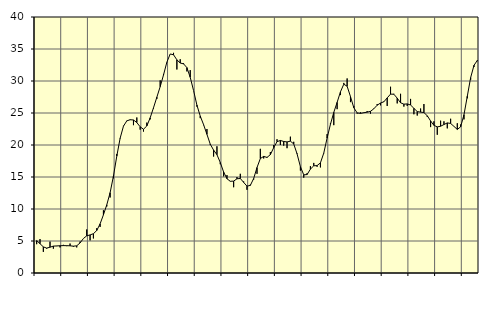
| Category | Piggar | Series 1 |
|---|---|---|
| nan | 4.5 | 5.07 |
| 87.0 | 5.3 | 4.58 |
| 87.0 | 3.3 | 4.08 |
| 87.0 | 3.8 | 3.89 |
| nan | 4.9 | 4.03 |
| 88.0 | 3.8 | 4.2 |
| 88.0 | 4.2 | 4.23 |
| 88.0 | 4 | 4.26 |
| nan | 4.4 | 4.28 |
| 89.0 | 4.2 | 4.27 |
| 89.0 | 4.6 | 4.25 |
| 89.0 | 4.1 | 4.19 |
| nan | 4 | 4.25 |
| 90.0 | 4.9 | 4.7 |
| 90.0 | 5.4 | 5.39 |
| 90.0 | 6.8 | 5.81 |
| nan | 5.1 | 5.95 |
| 91.0 | 5.4 | 6.14 |
| 91.0 | 7 | 6.64 |
| 91.0 | 7.2 | 7.68 |
| nan | 9.8 | 9.09 |
| 92.0 | 10.4 | 10.65 |
| 92.0 | 11.8 | 12.55 |
| 92.0 | 14.8 | 15.14 |
| nan | 18.6 | 18.26 |
| 93.0 | 21 | 21.06 |
| 93.0 | 23 | 22.94 |
| 93.0 | 23.8 | 23.77 |
| nan | 23.9 | 23.95 |
| 94.0 | 23.1 | 23.91 |
| 94.0 | 24.3 | 23.51 |
| 94.0 | 22.4 | 22.84 |
| nan | 22.1 | 22.46 |
| 95.0 | 23.5 | 22.98 |
| 95.0 | 24 | 24.25 |
| 95.0 | 25.7 | 25.82 |
| nan | 27.2 | 27.47 |
| 96.0 | 30.1 | 29.12 |
| 96.0 | 31.1 | 30.95 |
| 96.0 | 32.9 | 32.94 |
| nan | 34.2 | 34.22 |
| 97.0 | 34.4 | 34.1 |
| 97.0 | 31.8 | 33.31 |
| 97.0 | 33.4 | 32.81 |
| nan | 32.8 | 32.68 |
| 98.0 | 31.5 | 32.09 |
| 98.0 | 31.7 | 30.58 |
| 98.0 | 28.5 | 28.5 |
| nan | 26 | 26.23 |
| 99.0 | 24.2 | 24.52 |
| 99.0 | 23.1 | 23.18 |
| 99.0 | 22.5 | 21.67 |
| nan | 20 | 20.13 |
| 0.0 | 18.2 | 19.2 |
| 0.0 | 19.8 | 18.49 |
| 0.0 | 17 | 17.27 |
| nan | 15.1 | 15.78 |
| 1.0 | 15.3 | 14.73 |
| 1.0 | 14.3 | 14.33 |
| 1.0 | 13.4 | 14.36 |
| nan | 15 | 14.72 |
| 2.0 | 15.5 | 14.77 |
| 2.0 | 14.3 | 14.16 |
| 2.0 | 13 | 13.57 |
| nan | 13.8 | 13.69 |
| 3.0 | 14.6 | 14.76 |
| 3.0 | 15.5 | 16.48 |
| 3.0 | 19.4 | 17.88 |
| nan | 17.9 | 18.22 |
| 4.0 | 18 | 18.06 |
| 4.0 | 18.9 | 18.49 |
| 4.0 | 20 | 19.58 |
| nan | 20.9 | 20.52 |
| 5.0 | 20 | 20.71 |
| 5.0 | 19.9 | 20.55 |
| 5.0 | 19.5 | 20.48 |
| nan | 21.3 | 20.6 |
| 6.0 | 20.5 | 20.17 |
| 6.0 | 18.7 | 18.62 |
| 6.0 | 16 | 16.62 |
| nan | 14.9 | 15.34 |
| 7.0 | 15.6 | 15.38 |
| 7.0 | 16.7 | 16.23 |
| 7.0 | 17.2 | 16.75 |
| nan | 16.6 | 16.78 |
| 8.0 | 16.5 | 17.21 |
| 8.0 | 18.7 | 18.74 |
| 8.0 | 21.7 | 21.08 |
| nan | 23.4 | 23.23 |
| 9.0 | 23.1 | 25.1 |
| 9.0 | 25.6 | 26.66 |
| 9.0 | 27.8 | 28.31 |
| nan | 29.7 | 29.5 |
| 10.0 | 30.4 | 29.18 |
| 10.0 | 26.7 | 27.57 |
| 10.0 | 26.1 | 25.83 |
| nan | 24.9 | 25.01 |
| 11.0 | 25.1 | 24.94 |
| 11.0 | 25 | 25.04 |
| 11.0 | 25.3 | 25.13 |
| nan | 24.9 | 25.26 |
| 12.0 | 25.7 | 25.66 |
| 12.0 | 26.4 | 26.22 |
| 12.0 | 26.2 | 26.56 |
| nan | 26.8 | 26.75 |
| 13.0 | 26.1 | 27.36 |
| 13.0 | 29.1 | 27.95 |
| 13.0 | 28 | 27.93 |
| nan | 26.5 | 27.32 |
| 14.0 | 28 | 26.6 |
| 14.0 | 26 | 26.38 |
| 14.0 | 26.1 | 26.42 |
| nan | 27.2 | 26.25 |
| 15.0 | 24.8 | 25.73 |
| 15.0 | 24.6 | 25.22 |
| 15.0 | 25.7 | 25.14 |
| nan | 26.4 | 25.07 |
| 16.0 | 24.4 | 24.57 |
| 16.0 | 22.8 | 23.76 |
| 16.0 | 23.7 | 23.07 |
| nan | 21.6 | 22.83 |
| 17.0 | 23.8 | 22.93 |
| 17.0 | 23.7 | 23.2 |
| 17.0 | 22.6 | 23.45 |
| nan | 24.1 | 23.37 |
| 18.0 | 22.9 | 22.91 |
| 18.0 | 23.4 | 22.43 |
| 18.0 | 23.2 | 22.84 |
| nan | 24 | 24.73 |
| 19.0 | 27.3 | 27.63 |
| 19.0 | 30.2 | 30.53 |
| 19.0 | 32.2 | 32.45 |
| nan | 33.1 | 33.22 |